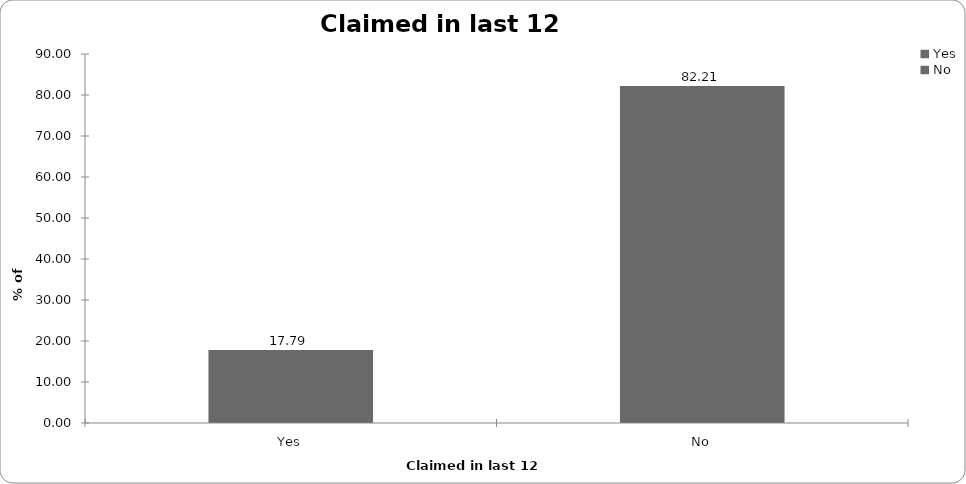
| Category | Claimed in last 12 months |
|---|---|
| Yes | 17.794 |
| No | 82.206 |